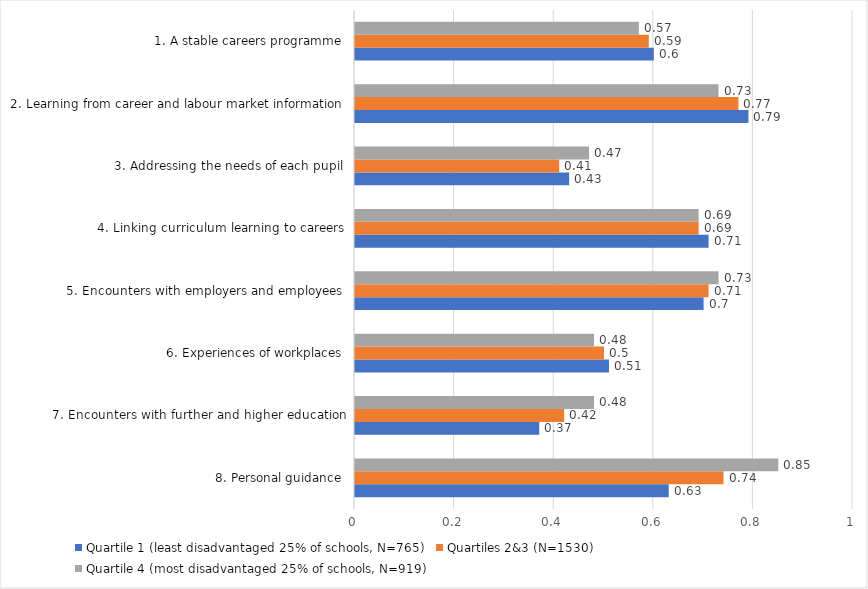
| Category | Quartile 1 (least disadvantaged 25% of schools, N=765) | Quartiles 2&3 (N=1530) | Quartile 4 (most disadvantaged 25% of schools, N=919) |
|---|---|---|---|
| 8. Personal guidance | 0.63 | 0.74 | 0.85 |
| 7. Encounters with further and higher education | 0.37 | 0.42 | 0.48 |
| 6. Experiences of workplaces | 0.51 | 0.5 | 0.48 |
| 5. Encounters with employers and employees | 0.7 | 0.71 | 0.73 |
| 4. Linking curriculum learning to careers | 0.71 | 0.69 | 0.69 |
| 3. Addressing the needs of each pupil | 0.43 | 0.41 | 0.47 |
| 2. Learning from career and labour market information | 0.79 | 0.77 | 0.73 |
| 1. A stable careers programme | 0.6 | 0.59 | 0.57 |